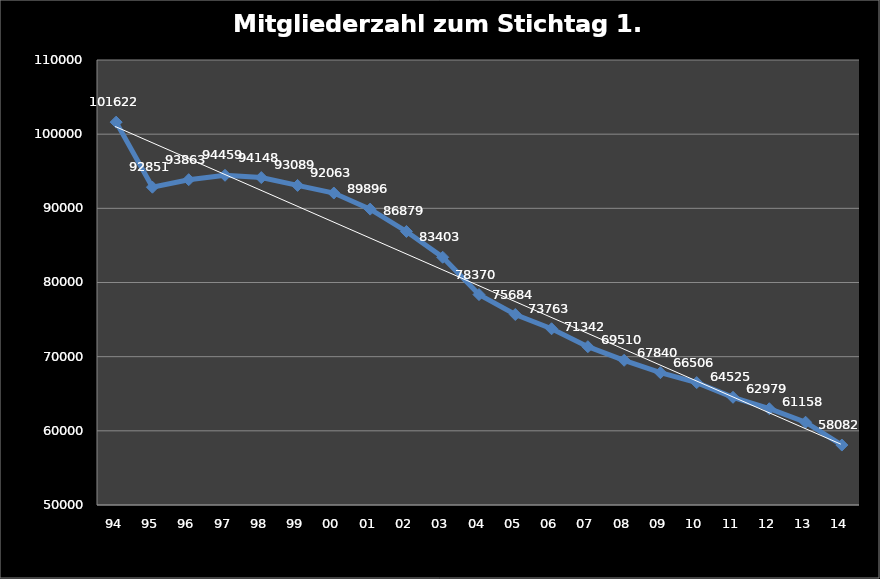
| Category | Mitgliederzahl zum Stichtag 1. Januar |
|---|---|
| 94 | 101622 |
| 95 | 92851 |
| 96 | 93863 |
| 97 | 94459 |
| 98 | 94148 |
| 99 | 93089 |
| 00 | 92063 |
| 01 | 89896 |
| 02 | 86879 |
| 03 | 83403 |
| 04 | 78370 |
| 05 | 75684 |
| 06 | 73763 |
| 07 | 71342 |
| 08 | 69510 |
| 09 | 67840 |
| 10 | 66506 |
| 11 | 64525 |
| 12 | 62979 |
| 13 | 61158 |
| 14 | 58082 |